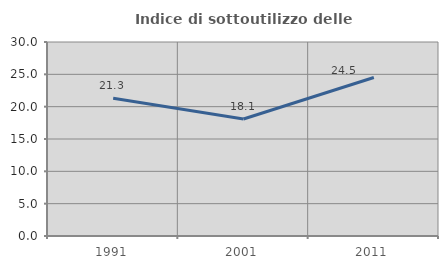
| Category | Indice di sottoutilizzo delle abitazioni  |
|---|---|
| 1991.0 | 21.297 |
| 2001.0 | 18.086 |
| 2011.0 | 24.513 |